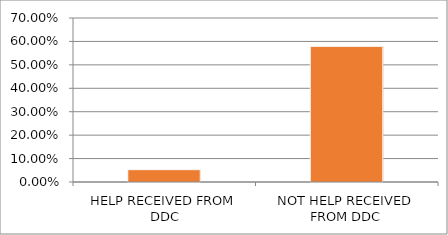
| Category | Series 0 |
|---|---|
| HELP RECEIVED FROM DDC | 0.053 |
| NOT HELP RECEIVED FROM DDC | 0.579 |